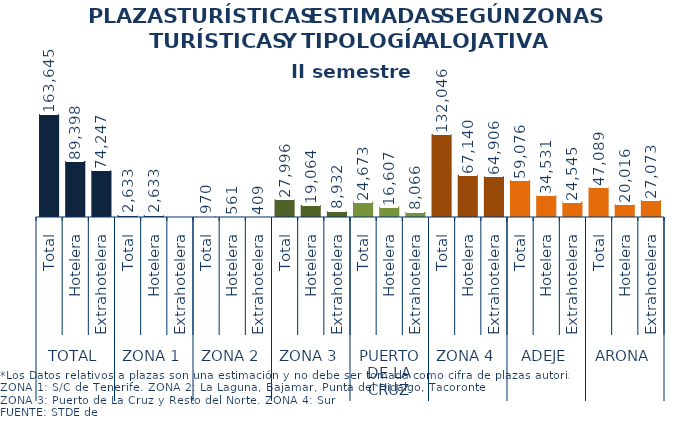
| Category | II semestre 2013 |
|---|---|
| 0 | 163645 |
| 1 | 89398 |
| 2 | 74247 |
| 3 | 2633 |
| 4 | 2633 |
| 5 | 0 |
| 6 | 970 |
| 7 | 561 |
| 8 | 409 |
| 9 | 27996 |
| 10 | 19064 |
| 11 | 8932 |
| 12 | 24673 |
| 13 | 16607 |
| 14 | 8066 |
| 15 | 132046 |
| 16 | 67140 |
| 17 | 64906 |
| 18 | 59076 |
| 19 | 34531 |
| 20 | 24545 |
| 21 | 47089 |
| 22 | 20016 |
| 23 | 27073 |